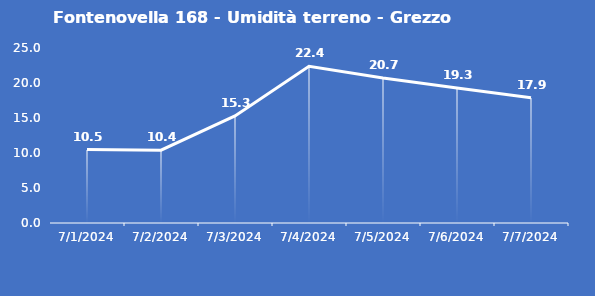
| Category | Fontenovella 168 - Umidità terreno - Grezzo (%VWC) |
|---|---|
| 7/1/24 | 10.5 |
| 7/2/24 | 10.4 |
| 7/3/24 | 15.3 |
| 7/4/24 | 22.4 |
| 7/5/24 | 20.7 |
| 7/6/24 | 19.3 |
| 7/7/24 | 17.9 |